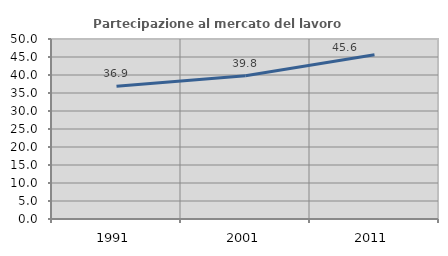
| Category | Partecipazione al mercato del lavoro  femminile |
|---|---|
| 1991.0 | 36.882 |
| 2001.0 | 39.82 |
| 2011.0 | 45.643 |